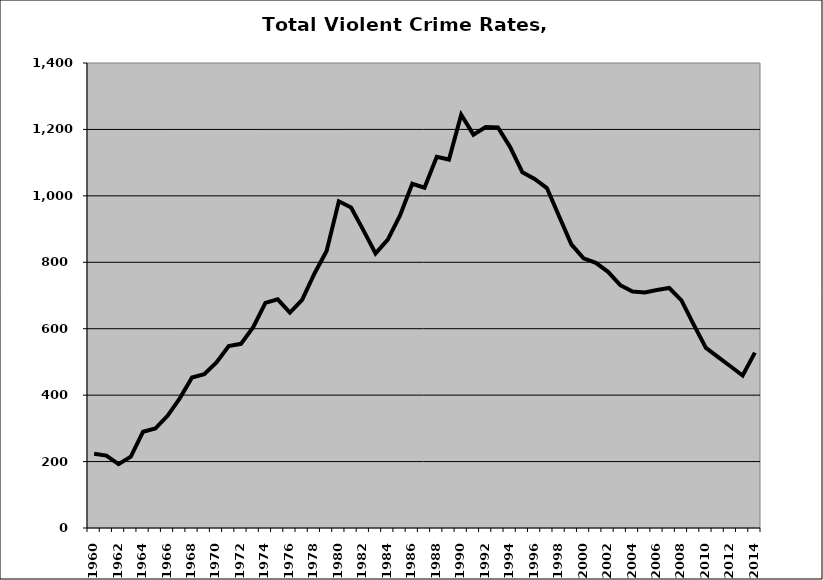
| Category | VCR |
|---|---|
| 1960.0 | 223.384 |
| 1961.0 | 217.848 |
| 1962.0 | 192.141 |
| 1963.0 | 214.968 |
| 1964.0 | 289.904 |
| 1965.0 | 299.5 |
| 1966.0 | 337.805 |
| 1967.0 | 390.309 |
| 1968.0 | 453.133 |
| 1969.0 | 462.874 |
| 1970.0 | 498.185 |
| 1971.0 | 547.863 |
| 1972.0 | 554.512 |
| 1973.0 | 604.572 |
| 1974.0 | 677.639 |
| 1975.0 | 688.525 |
| 1976.0 | 648.343 |
| 1977.0 | 686.843 |
| 1978.0 | 765.557 |
| 1979.0 | 833.871 |
| 1980.0 | 983.526 |
| 1981.0 | 965.07 |
| 1982.0 | 896.803 |
| 1983.0 | 826.704 |
| 1984.0 | 867.985 |
| 1985.0 | 941.149 |
| 1986.0 | 1036.514 |
| 1987.0 | 1024.436 |
| 1988.0 | 1117.743 |
| 1989.0 | 1109.423 |
| 1990.0 | 1244.326 |
| 1991.0 | 1184.326 |
| 1992.0 | 1207.199 |
| 1993.0 | 1206.046 |
| 1994.0 | 1146.821 |
| 1995.0 | 1070.952 |
| 1996.0 | 1051.042 |
| 1997.0 | 1023.584 |
| 1998.0 | 938.697 |
| 1999.0 | 853.96 |
| 2000.0 | 812.001 |
| 2001.0 | 798.329 |
| 2002.0 | 771.168 |
| 2003.0 | 731.094 |
| 2004.0 | 711.826 |
| 2005.0 | 708.89 |
| 2006.0 | 716.433 |
| 2007.0 | 722.592 |
| 2008.0 | 685.306 |
| 2009.0 | 612.478 |
| 2010.0 | 542.351 |
| 2011.0 | 514.604 |
| 2012.0 | 486.974 |
| 2013.0 | 459.13 |
| 2014.0 | 527.861 |